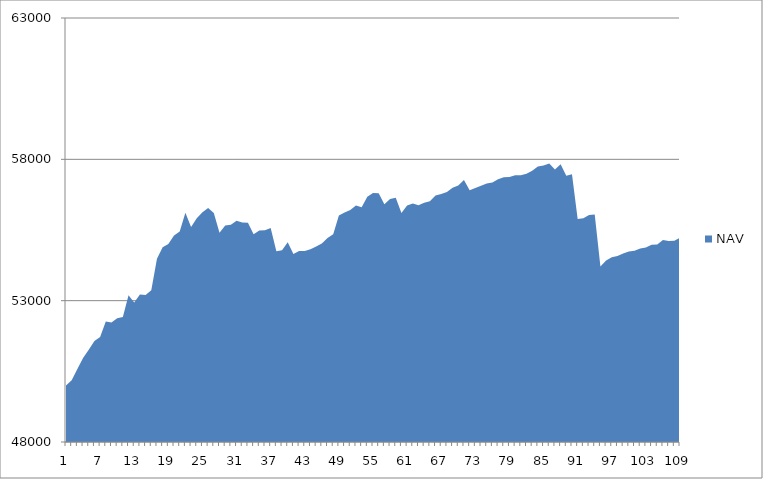
| Category | NAV |
|---|---|
| 0 | 50000 |
| 1 | 50185.185 |
| 2 | 50585.185 |
| 3 | 50973.977 |
| 4 | 51265.977 |
| 5 | 51576.741 |
| 6 | 51711.523 |
| 7 | 52262.893 |
| 8 | 52230.24 |
| 9 | 52381.556 |
| 10 | 52425.915 |
| 11 | 53192.581 |
| 12 | 52939.146 |
| 13 | 53220.069 |
| 14 | 53197.341 |
| 15 | 53369.61 |
| 16 | 54480.721 |
| 17 | 54888.365 |
| 18 | 55001.902 |
| 19 | 55308.308 |
| 20 | 55448.308 |
| 21 | 56110.305 |
| 22 | 55610.305 |
| 23 | 55916.954 |
| 24 | 56129.798 |
| 25 | 56279.798 |
| 26 | 56105.301 |
| 27 | 55401.645 |
| 28 | 55657.201 |
| 29 | 55686.925 |
| 30 | 55823.001 |
| 31 | 55769.596 |
| 32 | 55759.375 |
| 33 | 55350.284 |
| 34 | 55480.284 |
| 35 | 55492.498 |
| 36 | 55570.42 |
| 37 | 54746.89 |
| 38 | 54783.7 |
| 39 | 55066.459 |
| 40 | 54651.074 |
| 41 | 54754.078 |
| 42 | 54760.213 |
| 43 | 54816.924 |
| 44 | 54917.296 |
| 45 | 55025.73 |
| 46 | 55220.535 |
| 47 | 55353.465 |
| 48 | 56009.309 |
| 49 | 56118.959 |
| 50 | 56205.212 |
| 51 | 56362.876 |
| 52 | 56307.394 |
| 53 | 56678.935 |
| 54 | 56813.264 |
| 55 | 56799.502 |
| 56 | 56409.112 |
| 57 | 56596.44 |
| 58 | 56640.493 |
| 59 | 56102.227 |
| 60 | 56370.449 |
| 61 | 56434.248 |
| 62 | 56376.841 |
| 63 | 56464.524 |
| 64 | 56518.022 |
| 65 | 56724.747 |
| 66 | 56770.361 |
| 67 | 56848.099 |
| 68 | 56992.896 |
| 69 | 57073.571 |
| 70 | 57266.481 |
| 71 | 56908.016 |
| 72 | 56984.939 |
| 73 | 57069.276 |
| 74 | 57147.627 |
| 75 | 57179.83 |
| 76 | 57291.17 |
| 77 | 57366.35 |
| 78 | 57371.599 |
| 79 | 57439.215 |
| 80 | 57440.895 |
| 81 | 57490.895 |
| 82 | 57593.679 |
| 83 | 57746.643 |
| 84 | 57785.413 |
| 85 | 57849.748 |
| 86 | 57639.346 |
| 87 | 57828.82 |
| 88 | 57417.055 |
| 89 | 57471.335 |
| 90 | 55888.376 |
| 91 | 55913.907 |
| 92 | 56031.989 |
| 93 | 56044.711 |
| 94 | 54210.631 |
| 95 | 54422.612 |
| 96 | 54536.647 |
| 97 | 54575.903 |
| 98 | 54670.229 |
| 99 | 54737.367 |
| 100 | 54762.386 |
| 101 | 54842.923 |
| 102 | 54881.385 |
| 103 | 54978.816 |
| 104 | 54991.283 |
| 105 | 55149.699 |
| 106 | 55109.498 |
| 107 | 55121.656 |
| 108 | 55227.569 |